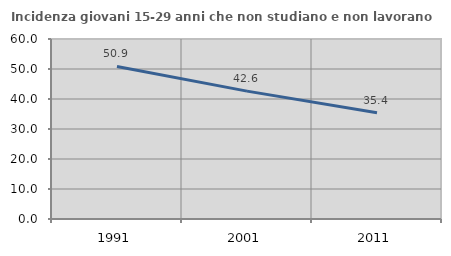
| Category | Incidenza giovani 15-29 anni che non studiano e non lavorano  |
|---|---|
| 1991.0 | 50.854 |
| 2001.0 | 42.627 |
| 2011.0 | 35.401 |